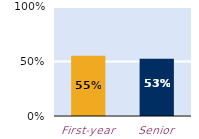
| Category | frequently |
|---|---|
| First-year | 0.553 |
| Senior | 0.525 |